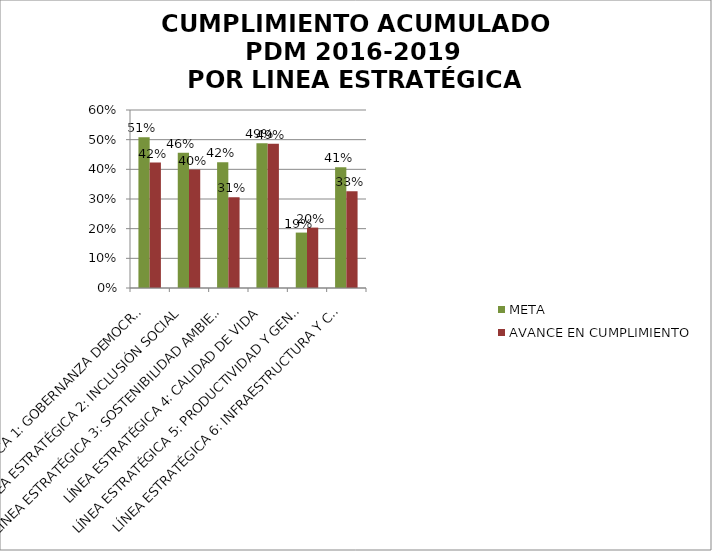
| Category | META | AVANCE EN CUMPLIMIENTO |
|---|---|---|
| LÍNEA ESTRATÉGICA 1: GOBERNANZA DEMOCRÁTICA | 0.508 | 0.423 |
| LÍNEA ESTRATÉGICA 2: INCLUSIÓN SOCIAL | 0.456 | 0.399 |
| LÍNEA ESTRATÉGICA 3: SOSTENIBILIDAD AMBIENTAL | 0.424 | 0.306 |
| LÍNEA ESTRATÉGICA 4: CALIDAD DE VIDA | 0.488 | 0.487 |
| LÍNEA ESTRATÉGICA 5: PRODUCTIVIDAD Y GENERACIÓN DE OPORTUNIDADES | 0.187 | 0.204 |
| LÍNEA ESTRATÉGICA 6: INFRAESTRUCTURA Y CONECTIVIDAD | 0.407 | 0.326 |